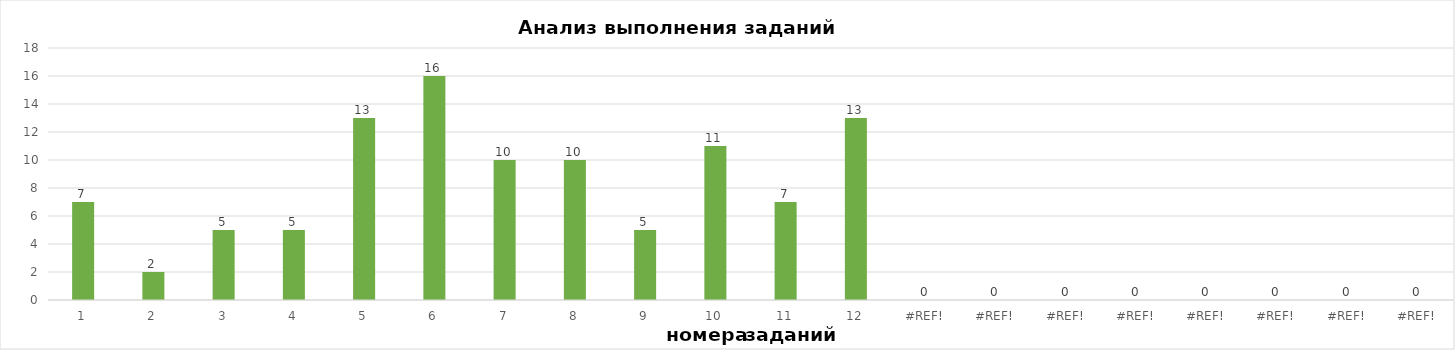
| Category | задания |
|---|---|
| 1.0 | 7 |
| 2.0 | 2 |
| 3.0 | 5 |
| 4.0 | 5 |
| 5.0 | 13 |
| 6.0 | 16 |
| 7.0 | 10 |
| 8.0 | 10 |
| 9.0 | 5 |
| 10.0 | 11 |
| 11.0 | 7 |
| 12.0 | 13 |
| 0.0 | 0 |
| 0.0 | 0 |
| 0.0 | 0 |
| 0.0 | 0 |
| 0.0 | 0 |
| 0.0 | 0 |
| 0.0 | 0 |
| 0.0 | 0 |